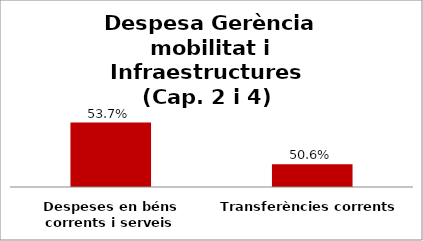
| Category | Series 0 |
|---|---|
| Despeses en béns corrents i serveis | 0.537 |
| Transferències corrents | 0.506 |